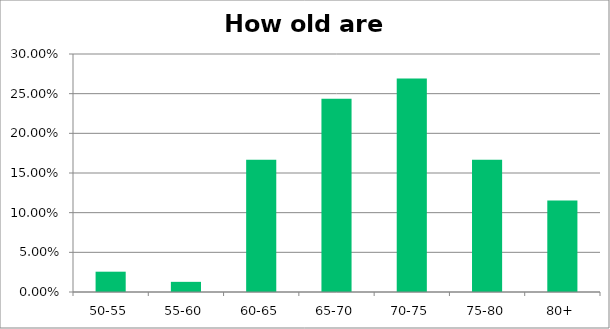
| Category | Responses |
|---|---|
| 50-55 | 0.026 |
| 55-60 | 0.013 |
| 60-65 | 0.167 |
| 65-70 | 0.244 |
| 70-75 | 0.269 |
| 75-80 | 0.167 |
| 80+ | 0.115 |